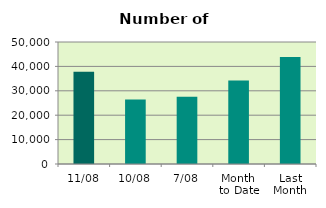
| Category | Series 0 |
|---|---|
| 11/08 | 37778 |
| 10/08 | 26414 |
| 7/08 | 27536 |
| Month 
to Date | 34205.714 |
| Last
Month | 43867.217 |